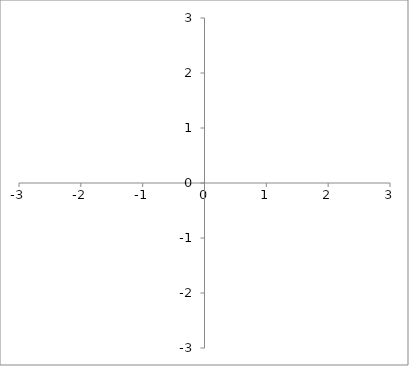
| Category | Series 0 |
|---|---|
| 0.0 | 0 |
| 0.0 | 0 |
| 0.0 | 0 |
| 0.0 | 0 |
| 0.0 | 0 |
| 0.0 | 0 |
| 0.0 | 0 |
| 0.0 | 0 |
| 0.0 | 0 |
| 0.0 | 0 |
| 0.0 | 0 |
| 0.0 | 0 |
| 0.0 | 0 |
| 0.0 | 0 |
| 0.0 | 0 |
| 0.0 | 0 |
| 0.0 | 0 |
| 0.0 | 0 |
| 0.0 | 0 |
| 0.0 | 0 |
| 0.0 | 0 |
| 0.0 | 0 |
| 0.0 | 0 |
| 0.0 | 0 |
| 0.0 | 0 |
| 0.0 | 0 |
| 0.0 | 0 |
| 0.0 | 0 |
| 0.0 | 0 |
| 0.0 | 0 |
| 0.0 | 0 |
| 0.0 | 0 |
| 0.0 | 0 |
| 0.0 | 0 |
| 0.0 | 0 |
| 0.0 | 0 |
| 0.0 | 0 |
| 0.0 | 0 |
| 0.0 | 0 |
| 0.0 | 0 |
| 0.0 | 0 |
| 0.0 | 0 |
| 0.0 | 0 |
| 0.0 | 0 |
| 0.0 | 0 |
| 0.0 | 0 |
| 0.0 | 0 |
| 0.0 | 0 |
| 0.0 | 0 |
| 0.0 | 0 |
| 0.0 | 0 |
| 0.0 | 0 |
| 0.0 | 0 |
| 0.0 | 0 |
| 0.0 | 0 |
| 0.0 | 0 |
| 0.0 | 0 |
| 0.0 | 0 |
| 0.0 | 0 |
| 0.0 | 0 |
| 0.0 | 0 |
| 0.0 | 0 |
| 0.0 | 0 |
| 0.0 | 0 |
| 0.0 | 0 |
| 0.0 | 0 |
| 0.0 | 0 |
| 0.0 | 0 |
| 0.0 | 0 |
| 0.0 | 0 |
| 0.0 | 0 |
| 0.0 | 0 |
| 0.0 | 0 |
| 0.0 | 0 |
| 0.0 | 0 |
| 0.0 | 0 |
| 0.0 | 0 |
| 0.0 | 0 |
| 0.0 | 0 |
| 0.0 | 0 |
| 0.0 | 0 |
| 0.0 | 0 |
| 0.0 | 0 |
| 0.0 | 0 |
| 0.0 | 0 |
| 0.0 | 0 |
| 0.0 | 0 |
| 0.0 | 0 |
| 0.0 | 0 |
| 0.0 | 0 |
| 0.0 | 0 |
| 0.0 | 0 |
| 0.0 | 0 |
| 0.0 | 0 |
| 0.0 | 0 |
| 0.0 | 0 |
| 0.0 | 0 |
| 0.0 | 0 |
| 0.0 | 0 |
| 0.0 | 0 |
| 0.0 | 0 |
| 0.0 | 0 |
| 0.0 | 0 |
| 0.0 | 0 |
| 0.0 | 0 |
| 0.0 | 0 |
| 0.0 | 0 |
| 0.0 | 0 |
| 0.0 | 0 |
| 0.0 | 0 |
| 0.0 | 0 |
| 0.0 | 0 |
| 0.0 | 0 |
| 0.0 | 0 |
| 0.0 | 0 |
| 0.0 | 0 |
| 0.0 | 0 |
| 0.0 | 0 |
| 0.0 | 0 |
| 0.0 | 0 |
| 0.0 | 0 |
| 0.0 | 0 |
| 0.0 | 0 |
| 0.0 | 0 |
| 0.0 | 0 |
| 0.0 | 0 |
| 0.0 | 0 |
| 0.0 | 0 |
| 0.0 | 0 |
| 0.0 | 0 |
| 0.0 | 0 |
| 0.0 | 0 |
| 0.0 | 0 |
| 0.0 | 0 |
| 0.0 | 0 |
| 0.0 | 0 |
| 0.0 | 0 |
| 0.0 | 0 |
| 0.0 | 0 |
| 0.0 | 0 |
| 0.0 | 0 |
| 0.0 | 0 |
| 0.0 | 0 |
| 0.0 | 0 |
| 0.0 | 0 |
| 0.0 | 0 |
| 0.0 | 0 |
| 0.0 | 0 |
| 0.0 | 0 |
| 0.0 | 0 |
| 0.0 | 0 |
| 0.0 | 0 |
| 0.0 | 0 |
| 0.0 | 0 |
| 0.0 | 0 |
| 0.0 | 0 |
| 0.0 | 0 |
| 0.0 | 0 |
| 0.0 | 0 |
| 0.0 | 0 |
| 0.0 | 0 |
| 0.0 | 0 |
| 0.0 | 0 |
| 0.0 | 0 |
| 0.0 | 0 |
| 0.0 | 0 |
| 0.0 | 0 |
| 0.0 | 0 |
| 0.0 | 0 |
| 0.0 | 0 |
| 0.0 | 0 |
| 0.0 | 0 |
| 0.0 | 0 |
| 0.0 | 0 |
| 0.0 | 0 |
| 0.0 | 0 |
| 0.0 | 0 |
| 0.0 | 0 |
| 0.0 | 0 |
| 0.0 | 0 |
| 0.0 | 0 |
| 0.0 | 0 |
| 0.0 | 0 |
| 0.0 | 0 |
| 0.0 | 0 |
| 0.0 | 0 |
| 0.0 | 0 |
| 0.0 | 0 |
| 0.0 | 0 |
| 0.0 | 0 |
| 0.0 | 0 |
| 0.0 | 0 |
| 0.0 | 0 |
| 0.0 | 0 |
| 0.0 | 0 |
| 0.0 | 0 |
| 0.0 | 0 |
| 0.0 | 0 |
| 0.0 | 0 |
| 0.0 | 0 |
| 0.0 | 0 |
| 0.0 | 0 |
| 0.0 | 0 |
| 0.0 | 0 |
| 0.0 | 0 |
| 0.0 | 0 |
| 0.0 | 0 |
| 0.0 | 0 |
| 0.0 | 0 |
| 0.0 | 0 |
| 0.0 | 0 |
| 0.0 | 0 |
| 0.0 | 0 |
| 0.0 | 0 |
| 0.0 | 0 |
| 0.0 | 0 |
| 0.0 | 0 |
| 0.0 | 0 |
| 0.0 | 0 |
| 0.0 | 0 |
| 0.0 | 0 |
| 0.0 | 0 |
| 0.0 | 0 |
| 0.0 | 0 |
| 0.0 | 0 |
| 0.0 | 0 |
| 0.0 | 0 |
| 0.0 | 0 |
| 0.0 | 0 |
| 0.0 | 0 |
| 0.0 | 0 |
| 0.0 | 0 |
| 0.0 | 0 |
| 0.0 | 0 |
| 0.0 | 0 |
| 0.0 | 0 |
| 0.0 | 0 |
| 0.0 | 0 |
| 0.0 | 0 |
| 0.0 | 0 |
| 0.0 | 0 |
| 0.0 | 0 |
| 0.0 | 0 |
| 0.0 | 0 |
| 0.0 | 0 |
| 0.0 | 0 |
| 0.0 | 0 |
| 0.0 | 0 |
| 0.0 | 0 |
| 0.0 | 0 |
| 0.0 | 0 |
| 0.0 | 0 |
| 0.0 | 0 |
| 0.0 | 0 |
| 0.0 | 0 |
| 0.0 | 0 |
| 0.0 | 0 |
| 0.0 | 0 |
| 0.0 | 0 |
| 0.0 | 0 |
| 0.0 | 0 |
| 0.0 | 0 |
| 0.0 | 0 |
| 0.0 | 0 |
| 0.0 | 0 |
| 0.0 | 0 |
| 0.0 | 0 |
| 0.0 | 0 |
| 0.0 | 0 |
| 0.0 | 0 |
| 0.0 | 0 |
| 0.0 | 0 |
| 0.0 | 0 |
| 0.0 | 0 |
| 0.0 | 0 |
| 0.0 | 0 |
| 0.0 | 0 |
| 0.0 | 0 |
| 0.0 | 0 |
| 0.0 | 0 |
| 0.0 | 0 |
| 0.0 | 0 |
| 0.0 | 0 |
| 0.0 | 0 |
| 0.0 | 0 |
| 0.0 | 0 |
| 0.0 | 0 |
| 0.0 | 0 |
| 0.0 | 0 |
| 0.0 | 0 |
| 0.0 | 0 |
| 0.0 | 0 |
| 0.0 | 0 |
| 0.0 | 0 |
| 0.0 | 0 |
| 0.0 | 0 |
| 0.0 | 0 |
| 0.0 | 0 |
| 0.0 | 0 |
| 0.0 | 0 |
| 0.0 | 0 |
| 0.0 | 0 |
| 0.0 | 0 |
| 0.0 | 0 |
| 0.0 | 0 |
| 0.0 | 0 |
| 0.0 | 0 |
| 0.0 | 0 |
| 0.0 | 0 |
| 0.0 | 0 |
| 0.0 | 0 |
| 0.0 | 0 |
| 0.0 | 0 |
| 0.0 | 0 |
| 0.0 | 0 |
| 0.0 | 0 |
| 0.0 | 0 |
| 0.0 | 0 |
| 0.0 | 0 |
| 0.0 | 0 |
| 0.0 | 0 |
| 0.0 | 0 |
| 0.0 | 0 |
| 0.0 | 0 |
| 0.0 | 0 |
| 0.0 | 0 |
| 0.0 | 0 |
| 0.0 | 0 |
| 0.0 | 0 |
| 0.0 | 0 |
| 0.0 | 0 |
| 0.0 | 0 |
| 0.0 | 0 |
| 0.0 | 0 |
| 0.0 | 0 |
| 0.0 | 0 |
| 0.0 | 0 |
| 0.0 | 0 |
| 0.0 | 0 |
| 0.0 | 0 |
| 0.0 | 0 |
| 0.0 | 0 |
| 0.0 | 0 |
| 0.0 | 0 |
| 0.0 | 0 |
| 0.0 | 0 |
| 0.0 | 0 |
| 0.0 | 0 |
| 0.0 | 0 |
| 0.0 | 0 |
| 0.0 | 0 |
| 0.0 | 0 |
| 0.0 | 0 |
| 0.0 | 0 |
| 0.0 | 0 |
| 0.0 | 0 |
| 0.0 | 0 |
| 0.0 | 0 |
| 0.0 | 0 |
| 0.0 | 0 |
| 0.0 | 0 |
| 0.0 | 0 |
| 0.0 | 0 |
| 0.0 | 0 |
| 0.0 | 0 |
| 0.0 | 0 |
| 0.0 | 0 |
| 0.0 | 0 |
| 0.0 | 0 |
| 0.0 | 0 |
| 0.0 | 0 |
| 0.0 | 0 |
| 0.0 | 0 |
| 0.0 | 0 |
| 0.0 | 0 |
| 0.0 | 0 |
| 0.0 | 0 |
| 0.0 | 0 |
| 0.0 | 0 |
| 0.0 | 0 |
| 0.0 | 0 |
| 0.0 | 0 |
| 0.0 | 0 |
| 0.0 | 0 |
| 0.0 | 0 |
| 0.0 | 0 |
| 0.0 | 0 |
| 0.0 | 0 |
| 0.0 | 0 |
| 0.0 | 0 |
| 0.0 | 0 |
| 0.0 | 0 |
| 0.0 | 0 |
| 0.0 | 0 |
| 0.0 | 0 |
| 0.0 | 0 |
| 0.0 | 0 |
| 0.0 | 0 |
| 0.0 | 0 |
| 0.0 | 0 |
| 0.0 | 0 |
| 0.0 | 0 |
| 0.0 | 0 |
| 0.0 | 0 |
| 0.0 | 0 |
| 0.0 | 0 |
| 0.0 | 0 |
| 0.0 | 0 |
| 0.0 | 0 |
| 0.0 | 0 |
| 0.0 | 0 |
| 0.0 | 0 |
| 0.0 | 0 |
| 0.0 | 0 |
| 0.0 | 0 |
| 0.0 | 0 |
| 0.0 | 0 |
| 0.0 | 0 |
| 0.0 | 0 |
| 0.0 | 0 |
| 0.0 | 0 |
| 0.0 | 0 |
| 0.0 | 0 |
| 0.0 | 0 |
| 0.0 | 0 |
| 0.0 | 0 |
| 0.0 | 0 |
| 0.0 | 0 |
| 0.0 | 0 |
| 0.0 | 0 |
| 0.0 | 0 |
| 0.0 | 0 |
| 0.0 | 0 |
| 0.0 | 0 |
| 0.0 | 0 |
| 0.0 | 0 |
| 0.0 | 0 |
| 0.0 | 0 |
| 0.0 | 0 |
| 0.0 | 0 |
| 0.0 | 0 |
| 0.0 | 0 |
| 0.0 | 0 |
| 0.0 | 0 |
| 0.0 | 0 |
| 0.0 | 0 |
| 0.0 | 0 |
| 0.0 | 0 |
| 0.0 | 0 |
| 0.0 | 0 |
| 0.0 | 0 |
| 0.0 | 0 |
| 0.0 | 0 |
| 0.0 | 0 |
| 0.0 | 0 |
| 0.0 | 0 |
| 0.0 | 0 |
| 0.0 | 0 |
| 0.0 | 0 |
| 0.0 | 0 |
| 0.0 | 0 |
| 0.0 | 0 |
| 0.0 | 0 |
| 0.0 | 0 |
| 0.0 | 0 |
| 0.0 | 0 |
| 0.0 | 0 |
| 0.0 | 0 |
| 0.0 | 0 |
| 0.0 | 0 |
| 0.0 | 0 |
| 0.0 | 0 |
| 0.0 | 0 |
| 0.0 | 0 |
| 0.0 | 0 |
| 0.0 | 0 |
| 0.0 | 0 |
| 0.0 | 0 |
| 0.0 | 0 |
| 0.0 | 0 |
| 0.0 | 0 |
| 0.0 | 0 |
| 0.0 | 0 |
| 0.0 | 0 |
| 0.0 | 0 |
| 0.0 | 0 |
| 0.0 | 0 |
| 0.0 | 0 |
| 0.0 | 0 |
| 0.0 | 0 |
| 0.0 | 0 |
| 0.0 | 0 |
| 0.0 | 0 |
| 0.0 | 0 |
| 0.0 | 0 |
| 0.0 | 0 |
| 0.0 | 0 |
| 0.0 | 0 |
| 0.0 | 0 |
| 0.0 | 0 |